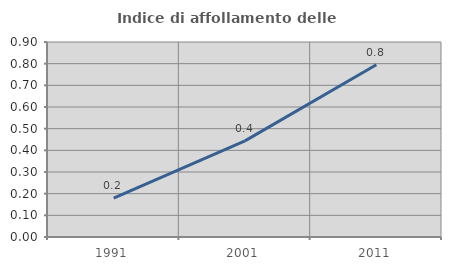
| Category | Indice di affollamento delle abitazioni  |
|---|---|
| 1991.0 | 0.18 |
| 2001.0 | 0.444 |
| 2011.0 | 0.795 |